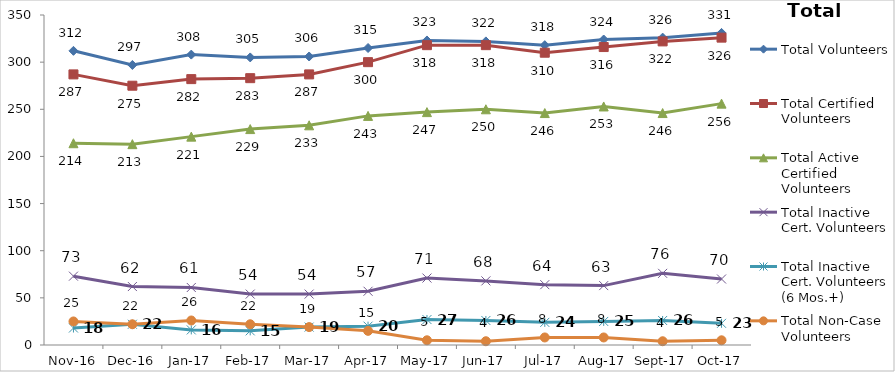
| Category | Total Volunteers | Total Certified Volunteers | Total Active Certified Volunteers | Total Inactive Cert. Volunteers | Total Inactive Cert. Volunteers (6 Mos.+) | Total Non-Case Volunteers |
|---|---|---|---|---|---|---|
| 2016-11-01 | 312 | 287 | 214 | 73 | 18 | 25 |
| 2016-12-01 | 297 | 275 | 213 | 62 | 22 | 22 |
| 2017-01-01 | 308 | 282 | 221 | 61 | 16 | 26 |
| 2017-02-01 | 305 | 283 | 229 | 54 | 15 | 22 |
| 2017-03-01 | 306 | 287 | 233 | 54 | 19 | 19 |
| 2017-04-01 | 315 | 300 | 243 | 57 | 20 | 15 |
| 2017-05-01 | 323 | 318 | 247 | 71 | 27 | 5 |
| 2017-06-01 | 322 | 318 | 250 | 68 | 26 | 4 |
| 2017-07-01 | 318 | 310 | 246 | 64 | 24 | 8 |
| 2017-08-01 | 324 | 316 | 253 | 63 | 25 | 8 |
| 2017-09-01 | 326 | 322 | 246 | 76 | 26 | 4 |
| 2017-10-01 | 331 | 326 | 256 | 70 | 23 | 5 |